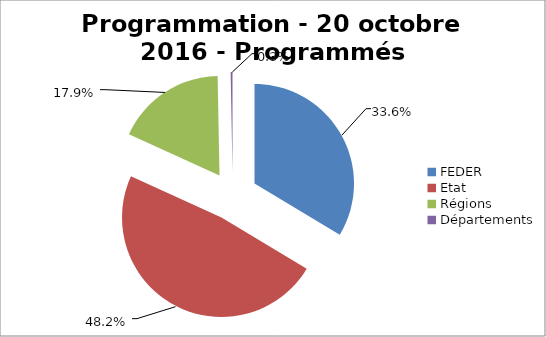
| Category | Series 0 |
|---|---|
| FEDER | 1660941.442 |
| Etat | 2379145.603 |
| Régions | 884464.24 |
| Départements | 14765 |